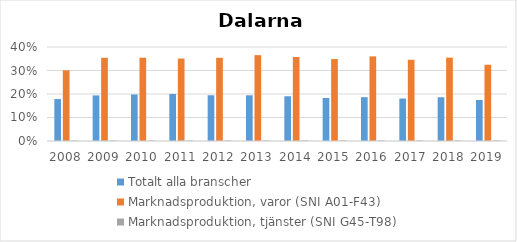
| Category | Totalt alla branscher | Marknadsproduktion, varor (SNI A01-F43) | Marknadsproduktion, tjänster (SNI G45-T98) |
|---|---|---|---|
| 2008 | 0.178 | 0.301 | 0.002 |
| 2009 | 0.194 | 0.354 | 0.002 |
| 2010 | 0.198 | 0.355 | 0.002 |
| 2011 | 0.2 | 0.351 | 0.002 |
| 2012 | 0.195 | 0.354 | 0.003 |
| 2013 | 0.194 | 0.365 | 0.002 |
| 2014 | 0.19 | 0.357 | 0.003 |
| 2015 | 0.183 | 0.349 | 0.003 |
| 2016 | 0.186 | 0.36 | 0.003 |
| 2017 | 0.181 | 0.346 | 0.003 |
| 2018 | 0.186 | 0.355 | 0.003 |
| 2019 | 0.174 | 0.325 | 0.003 |